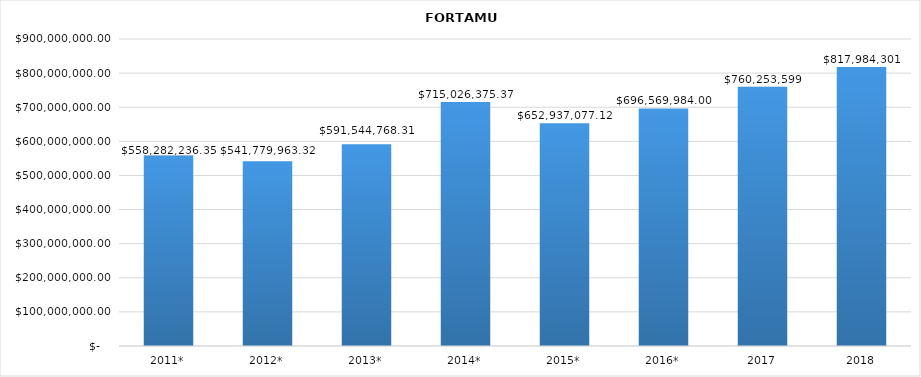
| Category | FORTAMUN  |
|---|---|
| 2011* | 558282236.354 |
| 2012* | 541779963.32 |
| 2013* | 591544768.312 |
| 2014* | 715026375.375 |
| 2015* | 652937077.12 |
| 2016* | 696569984 |
| 2017 | 760253598.7 |
| 2018 | 817984301.11 |